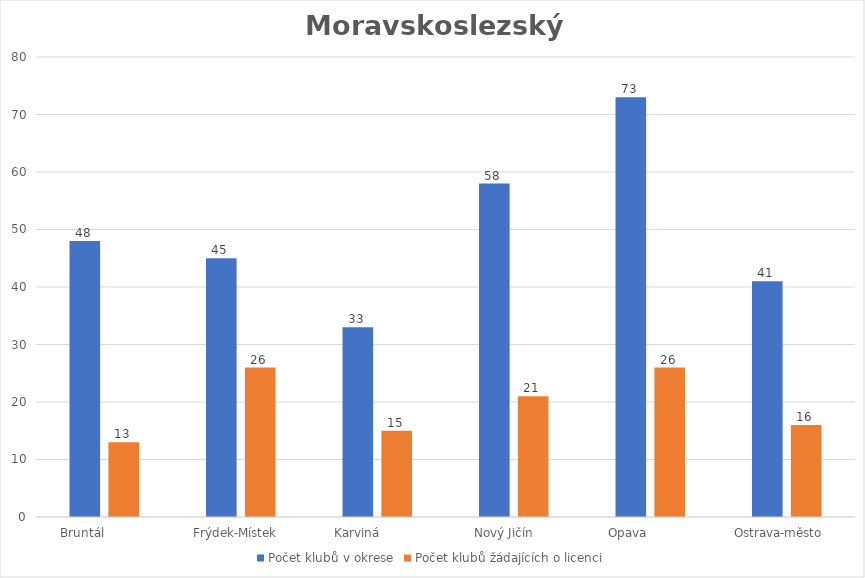
| Category | Počet klubů v okrese | Počet klubů žádajících o licenci |
|---|---|---|
| Bruntál            | 48 | 13 |
| Frýdek-Místek   | 45 | 26 |
| Karviná           | 33 | 15 |
| Nový Jičín     | 58 | 21 |
| Opava            | 73 | 26 |
| Ostrava-město    | 41 | 16 |